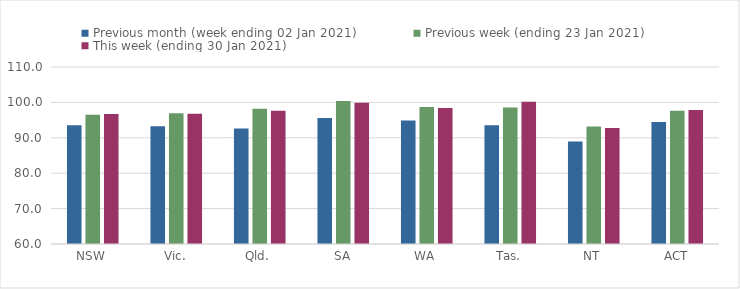
| Category | Previous month (week ending 02 Jan 2021) | Previous week (ending 23 Jan 2021) | This week (ending 30 Jan 2021) |
|---|---|---|---|
| NSW | 93.58 | 96.48 | 96.74 |
| Vic. | 93.26 | 96.94 | 96.79 |
| Qld. | 92.62 | 98.22 | 97.67 |
| SA | 95.6 | 100.43 | 99.89 |
| WA | 94.87 | 98.72 | 98.42 |
| Tas. | 93.54 | 98.54 | 100.15 |
| NT | 88.94 | 93.21 | 92.8 |
| ACT | 94.49 | 97.64 | 97.83 |